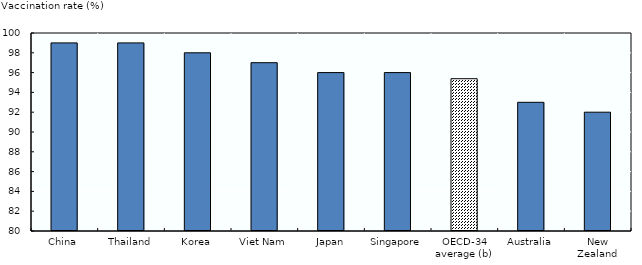
| Category | Series 1 |
|---|---|
| China | 99 |
| Thailand | 99 |
| Korea | 98 |
| Viet Nam | 97 |
| Japan | 96 |
| Singapore | 96 |
| OECD-34 average (b) | 95.382 |
| Australia | 93 |
| New Zealand | 92 |